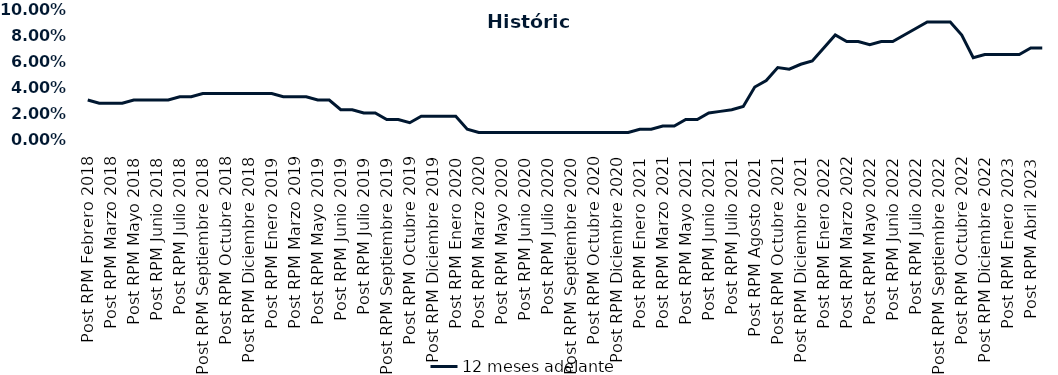
| Category | 12 meses adelante  |
|---|---|
| Post RPM Febrero 2018 | 0.03 |
| Pre RPM Marzo 2018 | 0.028 |
| Post RPM Marzo 2018 | 0.028 |
| Pre RPM Mayo 2018 | 0.028 |
| Post RPM Mayo 2018 | 0.03 |
| Pre RPM Junio 2018 | 0.03 |
| Post RPM Junio 2018 | 0.03 |
| Pre RPM Julio 2018 | 0.03 |
| Post RPM Julio 2018 | 0.032 |
| Pre RPM Septiembre 2018 | 0.032 |
| Post RPM Septiembre 2018 | 0.035 |
| Pre RPM Octubre 2018 | 0.035 |
| Post RPM Octubre 2018 | 0.035 |
| Pre RPM Diciembre 2018 | 0.035 |
| Post RPM Diciembre 2018 | 0.035 |
| Pre RPM Enero 2019 | 0.035 |
| Post RPM Enero 2019 | 0.035 |
| Pre RPM Marzo 2019 | 0.032 |
| Post RPM Marzo 2019 | 0.032 |
| Pre RPM Mayo 2019 | 0.032 |
| Post RPM Mayo 2019 | 0.03 |
| Pre RPM Junio 2019 | 0.03 |
| Post RPM Junio 2019 | 0.022 |
| Pre RPM Julio 2019 | 0.022 |
| Post RPM Julio 2019 | 0.02 |
| Pre RPM Septiembre 2019 | 0.02 |
| Post RPM Septiembre 2019 | 0.015 |
| Pre RPM Octubre 2019 | 0.015 |
| Post RPM Octubre 2019 | 0.012 |
| Pre RPM Diciembre 2019 | 0.018 |
| Post RPM Diciembre 2019 | 0.018 |
| Pre RPM Enero 2020 | 0.018 |
| Post RPM Enero 2020 | 0.018 |
| Pre RPM Marzo 2020 | 0.008 |
| Post RPM Marzo 2020 | 0.005 |
| Pre RPM Mayo 2020 | 0.005 |
| Post RPM Mayo 2020 | 0.005 |
| Pre RPM Junio 2020 | 0.005 |
| Post RPM Junio 2020 | 0.005 |
| Pre RPM Julio 2020 | 0.005 |
| Post RPM Julio 2020 | 0.005 |
| Pre RPM Septiembre 2020 | 0.005 |
| Post RPM Septiembre 2020 | 0.005 |
| Pre RPM Octubre 2020 | 0.005 |
| Post RPM Octubre 2020 | 0.005 |
| Pre RPM Diciembre 2020 | 0.005 |
| Post RPM Diciembre 2020 | 0.005 |
| Pre RPM Enero 2021 | 0.005 |
| Post RPM Enero 2021 | 0.008 |
| Pre RPM Marzo 2021 | 0.008 |
| Post RPM Marzo 2021 | 0.01 |
| Pre RPM Mayo 2021 | 0.01 |
| Post RPM Mayo 2021 | 0.015 |
| Pre RPM Junio 2021 | 0.015 |
| Post RPM Junio 2021 | 0.02 |
| Pre RPM Julio 2021 | 0.021 |
| Post RPM Julio 2021 | 0.022 |
| Pre RPM Agosto 2021 | 0.025 |
| Post RPM Agosto 2021 | 0.04 |
| Pre RPM Octubre 2021 | 0.045 |
| Post RPM Octubre 2021 | 0.055 |
| Pre RPM Diciembre 2021 | 0.054 |
| Post RPM Diciembre 2021 | 0.058 |
| Pre RPM Enero 2022 | 0.06 |
| Post RPM Enero 2022 | 0.07 |
| Pre RPM Marzo 2022 | 0.08 |
| Post RPM Marzo 2022 | 0.075 |
| Pre RPM Mayo 2022 | 0.075 |
| Post RPM Mayo 2022 | 0.072 |
| Pre RPM Junio 2022 | 0.075 |
| Post RPM Junio 2022 | 0.075 |
| Pre RPM Julio 2022 | 0.08 |
| Post RPM Julio 2022 | 0.085 |
| Pre RPM Septiembre 2022 | 0.09 |
| Post RPM Septiembre 2022 | 0.09 |
| Pre RPM Octubre 2022 | 0.09 |
| Post RPM Octubre 2022 | 0.08 |
| Pre RPM Diciembre 2022 | 0.062 |
| Post RPM Diciembre 2022 | 0.065 |
| Pre RPM Enero 2023 | 0.065 |
| Post RPM Enero 2023 | 0.065 |
| Pre RPM Abril 2023 | 0.065 |
| Post RPM Abril 2023 | 0.07 |
| Pre RPM Mayo 2023 | 0.07 |